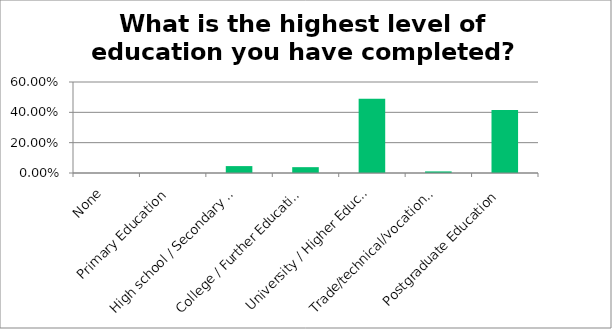
| Category | Responses |
|---|---|
| None | 0 |
| Primary Education | 0 |
| High school / Secondary Education | 0.046 |
| College / Further Education | 0.038 |
| University / Higher Education | 0.49 |
| Trade/technical/vocational Training | 0.01 |
| Postgraduate Education | 0.416 |